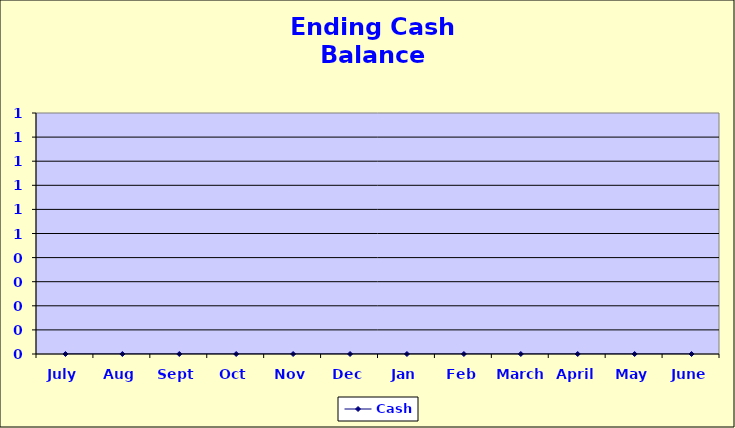
| Category | Cash |
|---|---|
| July | 0 |
| Aug | 0 |
| Sept | 0 |
| Oct | 0 |
| Nov | 0 |
| Dec | 0 |
| Jan | 0 |
| Feb | 0 |
| March | 0 |
| April | 0 |
| May | 0 |
| June | 0 |